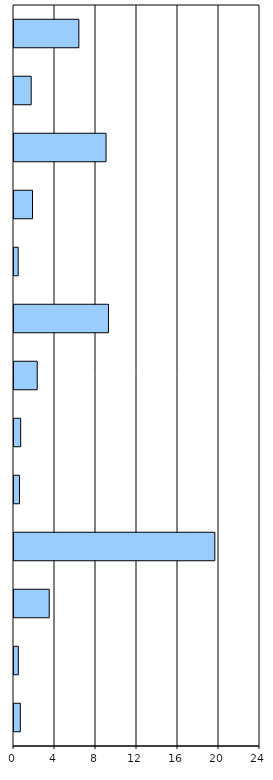
| Category | Series 0 |
|---|---|
| sonstige FB | 0.617 |
| Z00 - Z99 | 0.422 |
| S00 - T98 | 3.436 |
| M00 - M99 | 19.593 |
| L00 - L99 | 0.539 |
| K00 - K93 | 0.652 |
| J00 - J99 | 2.268 |
| I00 - I99 | 9.215 |
| H00 - H59 | 0.409 |
| G00 - G99 | 1.805 |
| F00 - F99 | 8.983 |
| E00 - E90 | 1.678 |
| C00 - D48 | 6.328 |